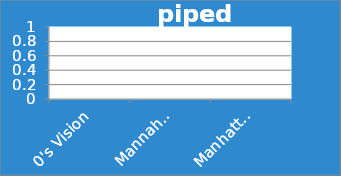
| Category | piped water |
|---|---|
| 0's Vision | 0 |
| Mannahatta (1609) | 0 |
| Manhattan (2010) | 0 |